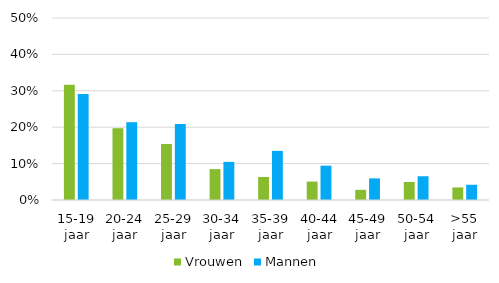
| Category | Vrouwen | Mannen |
|---|---|---|
| 15-19 jaar | 0.317 | 0.291 |
| 20-24 jaar | 0.197 | 0.214 |
| 25-29 jaar | 0.154 | 0.209 |
| 30-34 jaar | 0.085 | 0.105 |
| 35-39 jaar | 0.063 | 0.135 |
| 40-44 jaar | 0.051 | 0.094 |
| 45-49 jaar | 0.028 | 0.059 |
| 50-54 jaar | 0.05 | 0.065 |
| >55 jaar | 0.034 | 0.042 |